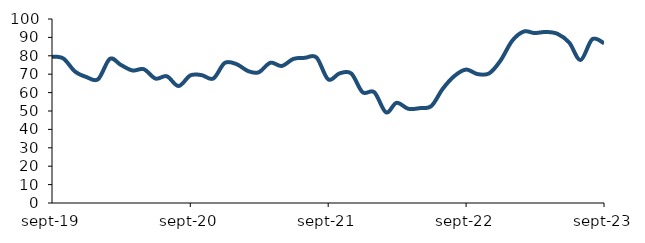
| Category | Series 0 |
|---|---|
| 2019-09-01 | 79.546 |
| 2019-10-01 | 78.535 |
| 2019-11-01 | 71.432 |
| 2019-12-01 | 68.463 |
| 2020-01-01 | 67.272 |
| 2020-02-01 | 78.312 |
| 2020-03-01 | 75.068 |
| 2020-04-01 | 72.017 |
| 2020-05-01 | 72.705 |
| 2020-06-01 | 67.626 |
| 2020-07-01 | 68.877 |
| 2020-08-01 | 63.558 |
| 2020-09-01 | 69.323 |
| 2020-10-01 | 69.489 |
| 2020-11-01 | 67.65 |
| 2020-12-01 | 76.09 |
| 2021-01-01 | 75.497 |
| 2021-02-01 | 71.694 |
| 2021-03-01 | 71.025 |
| 2021-04-01 | 76.23 |
| 2021-05-01 | 74.474 |
| 2021-06-01 | 78.315 |
| 2021-07-01 | 78.891 |
| 2021-08-01 | 79.094 |
| 2021-09-01 | 67.17 |
| 2021-10-01 | 70.437 |
| 2021-11-01 | 70.41 |
| 2021-12-01 | 60.199 |
| 2022-01-01 | 60.205 |
| 2022-02-01 | 49.281 |
| 2022-03-01 | 54.449 |
| 2022-04-01 | 51.197 |
| 2022-05-01 | 51.538 |
| 2022-06-01 | 52.702 |
| 2022-07-01 | 62.012 |
| 2022-08-01 | 69.008 |
| 2022-09-01 | 72.516 |
| 2022-10-01 | 70.073 |
| 2022-11-01 | 70.447 |
| 2022-12-01 | 77.358 |
| 2023-01-01 | 88.157 |
| 2023-02-01 | 93.208 |
| 2023-03-01 | 92.372 |
| 2023-04-01 | 92.95 |
| 2023-05-01 | 91.919 |
| 2023-06-01 | 87.183 |
| 2023-07-01 | 77.732 |
| 2023-08-01 | 89.007 |
| 2023-09-01 | 86.835 |